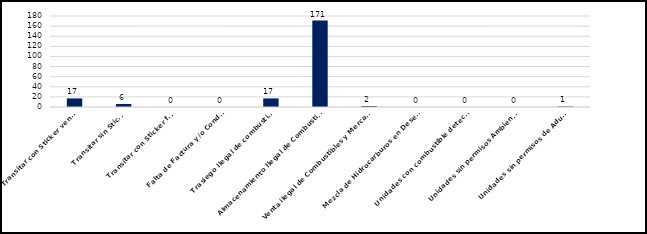
| Category | Series 0 |
|---|---|
| Transitar con Sticker vencido | 17 |
| Transitar sin Sticker | 6 |
| Transitar con Sticker falso | 0 |
| Falta de Factura y/o Conduce | 0 |
| Trasiego Ilegal de combustibles  | 17 |
| Almacenamiento Ilegal de Combustibles  | 171 |
| Venta ilegal de Combustibles y Mercancías | 2 |
| Mezcla de Hidrocarburos en Desechos | 0 |
| Unidades con combustible detectado  | 0 |
| Unidades sin permisos Ambientales | 0 |
| Unidades sin permisos de Aduanas  | 1 |